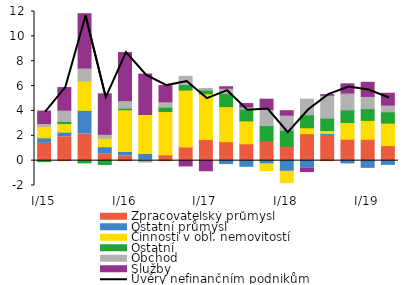
| Category | Zpracovatelský průmysl | Ostatní průmysl | Činnosti v obl. nemovitostí | Ostatní | Obchod | Služby  |
|---|---|---|---|---|---|---|
| I/15 | 1.388 | 0.445 | 0.922 | -0.079 | 0.229 | 1.003 |
| II | 1.916 | 0.374 | 0.691 | 0.172 | 0.915 | 1.814 |
| III | 2.137 | 1.906 | 2.363 | -0.183 | 1.046 | 4.372 |
| IV | 0.552 | 0.562 | 0.688 | -0.307 | 0.316 | 3.259 |
| I/16 | 0.372 | 0.362 | 3.359 | 0.125 | 0.608 | 3.869 |
| II | 0.072 | 0.502 | 3.138 | -0.03 | -0.089 | 3.256 |
| III | 0.454 | 0.013 | 3.483 | 0.349 | 0.432 | 1.308 |
| IV | 1.093 | 0.006 | 4.578 | 0.438 | 0.669 | -0.424 |
| I/17 | 1.697 | -0.007 | 3.685 | 0.293 | 0.129 | -0.807 |
| II | 1.525 | -0.317 | 2.819 | 1.064 | 0.413 | 0.125 |
| III | 1.353 | -0.534 | 1.841 | 0.958 | 0.173 | 0.267 |
| IV | 1.588 | -0.285 | -0.51 | 1.234 | 1.291 | 0.831 |
| I/18 | 1.158 | -0.865 | -0.911 | 1.288 | 1.216 | 0.357 |
| II | 2.167 | -0.624 | 0.481 | 1.042 | 1.258 | -0.254 |
| III | 2.025 | 0.159 | 0.235 | 0.999 | 1.841 | 0.054 |
| IV | 1.724 | -0.266 | 1.343 | 1.015 | 1.358 | 0.742 |
| I/19 | 1.715 | -0.621 | 1.524 | 0.943 | 0.986 | 1.134 |
| II | 1.207 | -0.381 | 1.811 | 0.911 | 0.542 | 0.952 |